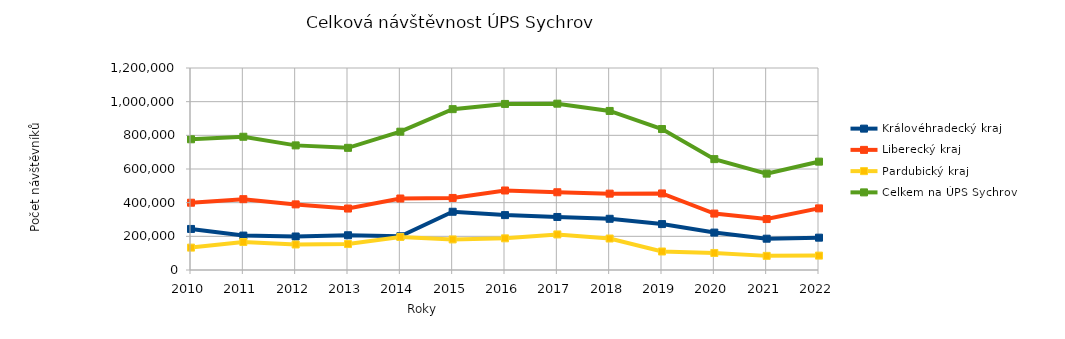
| Category | Královéhradecký kraj | Liberecký kraj | Pardubický kraj | Celkem na ÚPS Sychrov |
|---|---|---|---|---|
| 2010.0 | 243910 | 399672 | 133004 | 776586 |
| 2011.0 | 204481 | 420780 | 166238 | 791499 |
| 2012.0 | 199025 | 389781 | 151509 | 740315 |
| 2013.0 | 206419 | 365108 | 154165 | 725692 |
| 2014.0 | 200438 | 424718 | 196473 | 821629 |
| 2015.0 | 345970 | 428023 | 181567 | 955560 |
| 2016.0 | 326137 | 472318 | 188108 | 986563 |
| 2017.0 | 314983 | 461803 | 211268 | 988054 |
| 2018.0 | 304267 | 453568 | 187017 | 944852 |
| 2019.0 | 272720 | 454785 | 109949 | 837454 |
| 2020.0 | 222238 | 335261 | 101211 | 658710 |
| 2021.0 | 185934 | 302574 | 83925 | 572433 |
| 2022.0 | 192087 | 366076 | 85506 | 643669 |